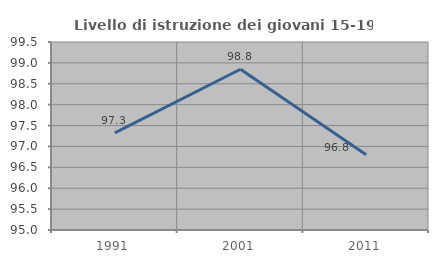
| Category | Livello di istruzione dei giovani 15-19 anni |
|---|---|
| 1991.0 | 97.326 |
| 2001.0 | 98.847 |
| 2011.0 | 96.8 |